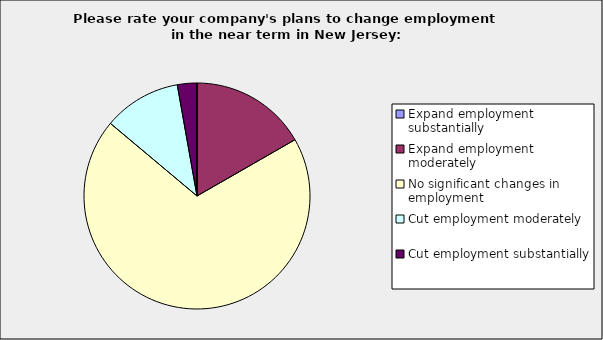
| Category | Series 0 |
|---|---|
| Expand employment substantially | 0 |
| Expand employment moderately | 0.167 |
| No significant changes in employment | 0.694 |
| Cut employment moderately | 0.111 |
| Cut employment substantially | 0.028 |